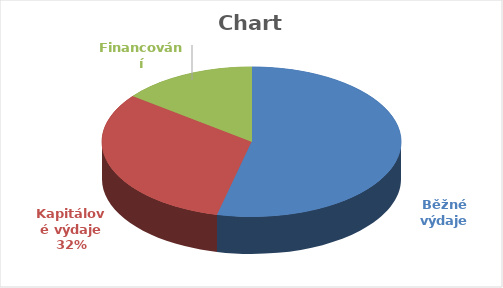
| Category | Series 0 |
|---|---|
| Běžné výdaje | 122154401.215 |
| Kapitálové výdaje | 72200281 |
| Financování | 33126871.785 |